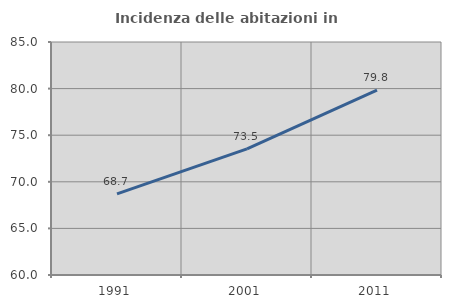
| Category | Incidenza delle abitazioni in proprietà  |
|---|---|
| 1991.0 | 68.699 |
| 2001.0 | 73.54 |
| 2011.0 | 79.834 |